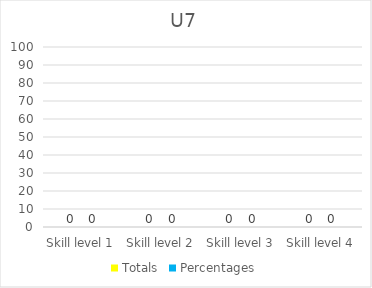
| Category | Totals | Percentages |
|---|---|---|
| Skill level 1 | 0 | 0 |
| Skill level 2 | 0 | 0 |
| Skill level 3 | 0 | 0 |
| Skill level 4 | 0 | 0 |